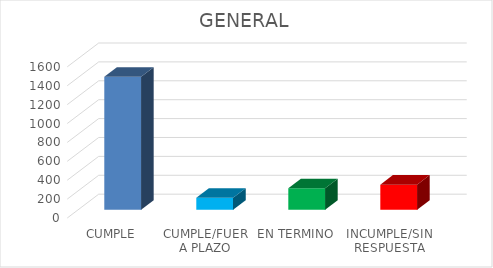
| Category | TOTAL |
|---|---|
| CUMPLE | 1408 |
| CUMPLE/FUERA PLAZO | 127 |
| EN TERMINO | 228 |
| INCUMPLE/SIN RESPUESTA | 266 |